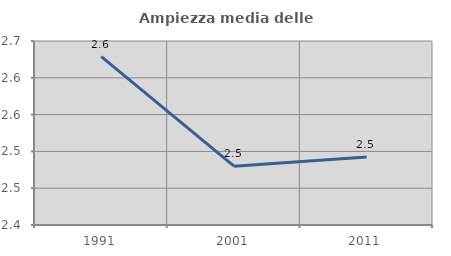
| Category | Ampiezza media delle famiglie |
|---|---|
| 1991.0 | 2.629 |
| 2001.0 | 2.48 |
| 2011.0 | 2.492 |